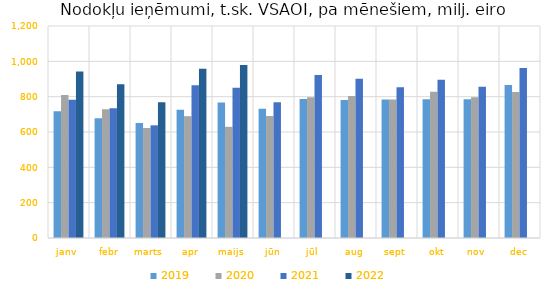
| Category | 2019 | 2020 | 2021 | 2022 |
|---|---|---|---|---|
| janv | 717665.072 | 809688.721 | 782986.001 | 941791.936 |
| febr | 677510.103 | 729172.133 | 734852.065 | 870814.989 |
| marts | 650253.135 | 622803.58 | 637891.51 | 769054.685 |
| apr | 726487.169 | 689512.187 | 864350.424 | 957835.152 |
| maijs | 766741.521 | 629295.897 | 850252.991 | 978678.559 |
| jūn | 731242 | 690672.482 | 768738.388 | 0 |
| jūl | 786636.326 | 796698.852 | 922262.256 | 0 |
| aug | 780536.674 | 803951.557 | 901674.184 | 0 |
| sept | 784169.124 | 783355.666 | 852725.586 | 0 |
| okt | 785502.085 | 827797.907 | 895873.595 | 0 |
| nov | 784818.309 | 797101.461 | 856461.1 | 0 |
| dec | 865773.712 | 826496.37 | 962936.043 | 0 |